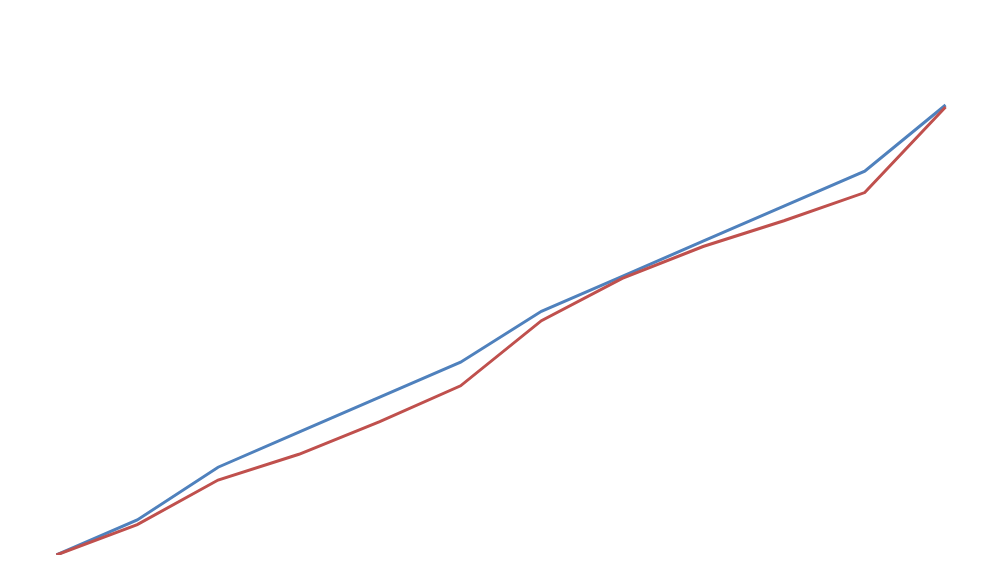
| Category | Rencana Keuangan Kumulatif | Realisasi Keuangan Kumulatif |
|---|---|---|
| 0 | 0 | 0 |
| 1 | 7.782 | 6.76 |
| 2 | 19.506 | 16.66 |
| 3 | 27.288 | 22.38 |
| 4 | 35.071 | 29.65 |
| 5 | 42.853 | 37.6 |
| 6 | 54.159 | 52.07 |
| 7 | 61.941 | 61.45 |
| 8 | 69.724 | 68.55 |
| 9 | 77.506 | 74.27 |
| 10 | 85.289 | 80.54 |
| 11 | 100 | 99.57 |